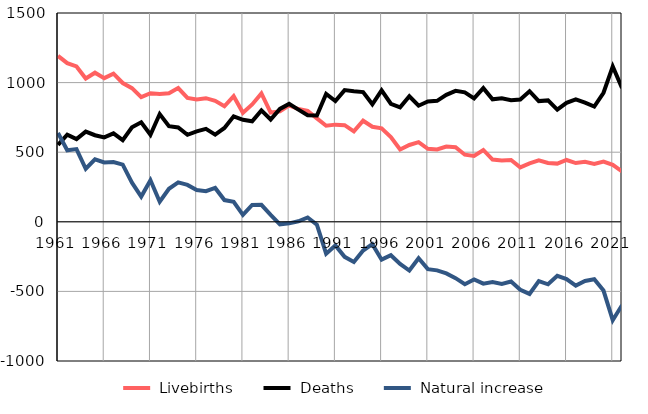
| Category |  Livebirths |  Deaths |  Natural increase |
|---|---|---|---|
| 1961.0 | 1192 | 553 | 639 |
| 1962.0 | 1140 | 626 | 514 |
| 1963.0 | 1116 | 594 | 522 |
| 1964.0 | 1029 | 648 | 381 |
| 1965.0 | 1071 | 622 | 449 |
| 1966.0 | 1032 | 606 | 426 |
| 1967.0 | 1064 | 635 | 429 |
| 1968.0 | 997 | 586 | 411 |
| 1969.0 | 960 | 679 | 281 |
| 1970.0 | 896 | 715 | 181 |
| 1971.0 | 924 | 625 | 299 |
| 1972.0 | 918 | 774 | 144 |
| 1973.0 | 924 | 687 | 237 |
| 1974.0 | 961 | 678 | 283 |
| 1975.0 | 890 | 625 | 265 |
| 1976.0 | 878 | 650 | 228 |
| 1977.0 | 888 | 668 | 220 |
| 1978.0 | 869 | 626 | 243 |
| 1979.0 | 830 | 674 | 156 |
| 1980.0 | 902 | 758 | 144 |
| 1981.0 | 783 | 733 | 50 |
| 1982.0 | 843 | 722 | 121 |
| 1983.0 | 922 | 800 | 122 |
| 1984.0 | 785 | 735 | 50 |
| 1985.0 | 793 | 811 | -18 |
| 1986.0 | 836 | 847 | -11 |
| 1987.0 | 810 | 806 | 4 |
| 1988.0 | 797 | 766 | 31 |
| 1989.0 | 743 | 764 | -21 |
| 1990.0 | 690 | 919 | -229 |
| 1991.0 | 698 | 868 | -170 |
| 1992.0 | 694 | 946 | -252 |
| 1993.0 | 650 | 938 | -288 |
| 1994.0 | 726 | 932 | -206 |
| 1995.0 | 683 | 844 | -161 |
| 1996.0 | 672 | 944 | -272 |
| 1997.0 | 608 | 848 | -240 |
| 1998.0 | 519 | 822 | -303 |
| 1999.0 | 552 | 902 | -350 |
| 2000.0 | 572 | 834 | -262 |
| 2001.0 | 524 | 864 | -340 |
| 2002.0 | 520 | 869 | -349 |
| 2003.0 | 541 | 912 | -371 |
| 2004.0 | 536 | 941 | -405 |
| 2005.0 | 482 | 930 | -448 |
| 2006.0 | 473 | 887 | -414 |
| 2007.0 | 516 | 960 | -444 |
| 2008.0 | 447 | 880 | -433 |
| 2009.0 | 441 | 887 | -446 |
| 2010.0 | 444 | 873 | -429 |
| 2011.0 | 391 | 879 | -488 |
| 2012.0 | 420 | 938 | -518 |
| 2013.0 | 441 | 867 | -426 |
| 2014.0 | 423 | 872 | -449 |
| 2015.0 | 418 | 806 | -388 |
| 2016.0 | 444 | 855 | -411 |
| 2017.0 | 422 | 880 | -458 |
| 2018.0 | 431 | 856 | -425 |
| 2019.0 | 415 | 828 | -413 |
| 2020.0 | 433 | 927 | -494 |
| 2021.0 | 409 | 1116 | -707 |
| 2022.0 | 362 | 961 | -599 |